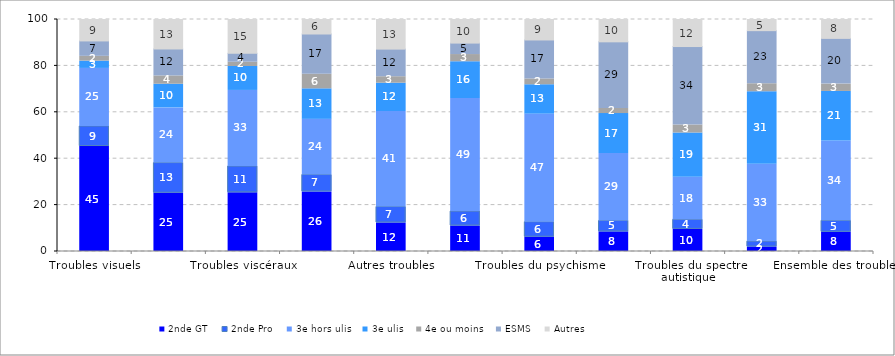
| Category | 2nde GT | 2nde Pro | 3e hors ulis | 3e ulis | 4e ou moins | ESMS | Autres |
|---|---|---|---|---|---|---|---|
| Troubles visuels | 45.249 | 8.622 | 25.037 | 3.157 | 2.063 | 6.631 | 9.24 |
| Troubles moteurs | 25.12 | 12.984 | 23.793 | 10.197 | 3.566 | 11.635 | 12.706 |
| Troubles viscéraux | 25.302 | 11.318 | 32.805 | 10.307 | 1.858 | 3.815 | 14.595 |
| Troubles auditifs | 25.683 | 7.277 | 24.002 | 13.156 | 6.277 | 17.353 | 6.251 |
| Autres troubles | 12.293 | 6.872 | 41.187 | 12.191 | 2.792 | 11.897 | 12.767 |
| Troubles du langage et de la parole | 10.983 | 6.224 | 48.773 | 15.819 | 3.095 | 4.94 | 10.167 |
| Troubles du psychisme | 6.168 | 6.457 | 46.592 | 12.656 | 2.483 | 16.82 | 8.824 |
| Plusieurs troubles associés | 8.456 | 4.702 | 29.097 | 17.199 | 2.206 | 28.713 | 9.628 |
| Troubles du spectre autistique | 9.54 | 4.122 | 18.346 | 19.07 | 3.429 | 33.838 | 11.654 |
| Troubles intellectuels et cognitifs | 1.95 | 2.314 | 33.343 | 31.266 | 3.43 | 22.889 | 4.809 |
| Ensemble des troubles | 8.283 | 4.919 | 34.48 | 21.302 | 3.183 | 19.69 | 8.144 |